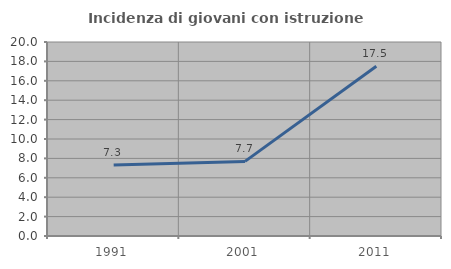
| Category | Incidenza di giovani con istruzione universitaria |
|---|---|
| 1991.0 | 7.317 |
| 2001.0 | 7.692 |
| 2011.0 | 17.5 |